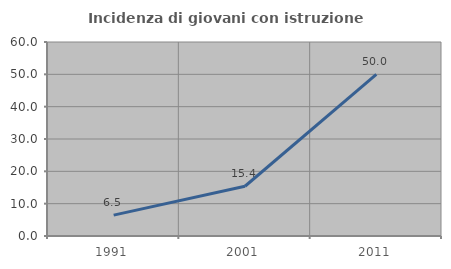
| Category | Incidenza di giovani con istruzione universitaria |
|---|---|
| 1991.0 | 6.452 |
| 2001.0 | 15.385 |
| 2011.0 | 50 |